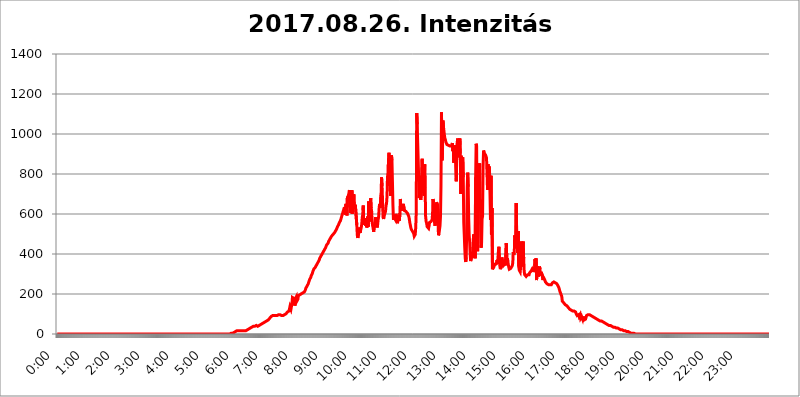
| Category | 2017.08.26. Intenzitás [W/m^2] |
|---|---|
| 0.0 | 0 |
| 0.0006944444444444445 | 0 |
| 0.001388888888888889 | 0 |
| 0.0020833333333333333 | 0 |
| 0.002777777777777778 | 0 |
| 0.003472222222222222 | 0 |
| 0.004166666666666667 | 0 |
| 0.004861111111111111 | 0 |
| 0.005555555555555556 | 0 |
| 0.0062499999999999995 | 0 |
| 0.006944444444444444 | 0 |
| 0.007638888888888889 | 0 |
| 0.008333333333333333 | 0 |
| 0.009027777777777779 | 0 |
| 0.009722222222222222 | 0 |
| 0.010416666666666666 | 0 |
| 0.011111111111111112 | 0 |
| 0.011805555555555555 | 0 |
| 0.012499999999999999 | 0 |
| 0.013194444444444444 | 0 |
| 0.013888888888888888 | 0 |
| 0.014583333333333332 | 0 |
| 0.015277777777777777 | 0 |
| 0.015972222222222224 | 0 |
| 0.016666666666666666 | 0 |
| 0.017361111111111112 | 0 |
| 0.018055555555555557 | 0 |
| 0.01875 | 0 |
| 0.019444444444444445 | 0 |
| 0.02013888888888889 | 0 |
| 0.020833333333333332 | 0 |
| 0.02152777777777778 | 0 |
| 0.022222222222222223 | 0 |
| 0.02291666666666667 | 0 |
| 0.02361111111111111 | 0 |
| 0.024305555555555556 | 0 |
| 0.024999999999999998 | 0 |
| 0.025694444444444447 | 0 |
| 0.02638888888888889 | 0 |
| 0.027083333333333334 | 0 |
| 0.027777777777777776 | 0 |
| 0.02847222222222222 | 0 |
| 0.029166666666666664 | 0 |
| 0.029861111111111113 | 0 |
| 0.030555555555555555 | 0 |
| 0.03125 | 0 |
| 0.03194444444444445 | 0 |
| 0.03263888888888889 | 0 |
| 0.03333333333333333 | 0 |
| 0.034027777777777775 | 0 |
| 0.034722222222222224 | 0 |
| 0.035416666666666666 | 0 |
| 0.036111111111111115 | 0 |
| 0.03680555555555556 | 0 |
| 0.0375 | 0 |
| 0.03819444444444444 | 0 |
| 0.03888888888888889 | 0 |
| 0.03958333333333333 | 0 |
| 0.04027777777777778 | 0 |
| 0.04097222222222222 | 0 |
| 0.041666666666666664 | 0 |
| 0.042361111111111106 | 0 |
| 0.04305555555555556 | 0 |
| 0.043750000000000004 | 0 |
| 0.044444444444444446 | 0 |
| 0.04513888888888889 | 0 |
| 0.04583333333333334 | 0 |
| 0.04652777777777778 | 0 |
| 0.04722222222222222 | 0 |
| 0.04791666666666666 | 0 |
| 0.04861111111111111 | 0 |
| 0.049305555555555554 | 0 |
| 0.049999999999999996 | 0 |
| 0.05069444444444445 | 0 |
| 0.051388888888888894 | 0 |
| 0.052083333333333336 | 0 |
| 0.05277777777777778 | 0 |
| 0.05347222222222222 | 0 |
| 0.05416666666666667 | 0 |
| 0.05486111111111111 | 0 |
| 0.05555555555555555 | 0 |
| 0.05625 | 0 |
| 0.05694444444444444 | 0 |
| 0.057638888888888885 | 0 |
| 0.05833333333333333 | 0 |
| 0.05902777777777778 | 0 |
| 0.059722222222222225 | 0 |
| 0.06041666666666667 | 0 |
| 0.061111111111111116 | 0 |
| 0.06180555555555556 | 0 |
| 0.0625 | 0 |
| 0.06319444444444444 | 0 |
| 0.06388888888888888 | 0 |
| 0.06458333333333334 | 0 |
| 0.06527777777777778 | 0 |
| 0.06597222222222222 | 0 |
| 0.06666666666666667 | 0 |
| 0.06736111111111111 | 0 |
| 0.06805555555555555 | 0 |
| 0.06874999999999999 | 0 |
| 0.06944444444444443 | 0 |
| 0.07013888888888889 | 0 |
| 0.07083333333333333 | 0 |
| 0.07152777777777779 | 0 |
| 0.07222222222222223 | 0 |
| 0.07291666666666667 | 0 |
| 0.07361111111111111 | 0 |
| 0.07430555555555556 | 0 |
| 0.075 | 0 |
| 0.07569444444444444 | 0 |
| 0.0763888888888889 | 0 |
| 0.07708333333333334 | 0 |
| 0.07777777777777778 | 0 |
| 0.07847222222222222 | 0 |
| 0.07916666666666666 | 0 |
| 0.0798611111111111 | 0 |
| 0.08055555555555556 | 0 |
| 0.08125 | 0 |
| 0.08194444444444444 | 0 |
| 0.08263888888888889 | 0 |
| 0.08333333333333333 | 0 |
| 0.08402777777777777 | 0 |
| 0.08472222222222221 | 0 |
| 0.08541666666666665 | 0 |
| 0.08611111111111112 | 0 |
| 0.08680555555555557 | 0 |
| 0.08750000000000001 | 0 |
| 0.08819444444444445 | 0 |
| 0.08888888888888889 | 0 |
| 0.08958333333333333 | 0 |
| 0.09027777777777778 | 0 |
| 0.09097222222222222 | 0 |
| 0.09166666666666667 | 0 |
| 0.09236111111111112 | 0 |
| 0.09305555555555556 | 0 |
| 0.09375 | 0 |
| 0.09444444444444444 | 0 |
| 0.09513888888888888 | 0 |
| 0.09583333333333333 | 0 |
| 0.09652777777777777 | 0 |
| 0.09722222222222222 | 0 |
| 0.09791666666666667 | 0 |
| 0.09861111111111111 | 0 |
| 0.09930555555555555 | 0 |
| 0.09999999999999999 | 0 |
| 0.10069444444444443 | 0 |
| 0.1013888888888889 | 0 |
| 0.10208333333333335 | 0 |
| 0.10277777777777779 | 0 |
| 0.10347222222222223 | 0 |
| 0.10416666666666667 | 0 |
| 0.10486111111111111 | 0 |
| 0.10555555555555556 | 0 |
| 0.10625 | 0 |
| 0.10694444444444444 | 0 |
| 0.1076388888888889 | 0 |
| 0.10833333333333334 | 0 |
| 0.10902777777777778 | 0 |
| 0.10972222222222222 | 0 |
| 0.1111111111111111 | 0 |
| 0.11180555555555556 | 0 |
| 0.11180555555555556 | 0 |
| 0.1125 | 0 |
| 0.11319444444444444 | 0 |
| 0.11388888888888889 | 0 |
| 0.11458333333333333 | 0 |
| 0.11527777777777777 | 0 |
| 0.11597222222222221 | 0 |
| 0.11666666666666665 | 0 |
| 0.1173611111111111 | 0 |
| 0.11805555555555557 | 0 |
| 0.11944444444444445 | 0 |
| 0.12013888888888889 | 0 |
| 0.12083333333333333 | 0 |
| 0.12152777777777778 | 0 |
| 0.12222222222222223 | 0 |
| 0.12291666666666667 | 0 |
| 0.12291666666666667 | 0 |
| 0.12361111111111112 | 0 |
| 0.12430555555555556 | 0 |
| 0.125 | 0 |
| 0.12569444444444444 | 0 |
| 0.12638888888888888 | 0 |
| 0.12708333333333333 | 0 |
| 0.16875 | 0 |
| 0.12847222222222224 | 0 |
| 0.12916666666666668 | 0 |
| 0.12986111111111112 | 0 |
| 0.13055555555555556 | 0 |
| 0.13125 | 0 |
| 0.13194444444444445 | 0 |
| 0.1326388888888889 | 0 |
| 0.13333333333333333 | 0 |
| 0.13402777777777777 | 0 |
| 0.13402777777777777 | 0 |
| 0.13472222222222222 | 0 |
| 0.13541666666666666 | 0 |
| 0.1361111111111111 | 0 |
| 0.13749999999999998 | 0 |
| 0.13819444444444443 | 0 |
| 0.1388888888888889 | 0 |
| 0.13958333333333334 | 0 |
| 0.14027777777777778 | 0 |
| 0.14097222222222222 | 0 |
| 0.14166666666666666 | 0 |
| 0.1423611111111111 | 0 |
| 0.14305555555555557 | 0 |
| 0.14375000000000002 | 0 |
| 0.14444444444444446 | 0 |
| 0.1451388888888889 | 0 |
| 0.1451388888888889 | 0 |
| 0.14652777777777778 | 0 |
| 0.14722222222222223 | 0 |
| 0.14791666666666667 | 0 |
| 0.1486111111111111 | 0 |
| 0.14930555555555555 | 0 |
| 0.15 | 0 |
| 0.15069444444444444 | 0 |
| 0.15138888888888888 | 0 |
| 0.15208333333333332 | 0 |
| 0.15277777777777776 | 0 |
| 0.15347222222222223 | 0 |
| 0.15416666666666667 | 0 |
| 0.15486111111111112 | 0 |
| 0.15555555555555556 | 0 |
| 0.15625 | 0 |
| 0.15694444444444444 | 0 |
| 0.15763888888888888 | 0 |
| 0.15833333333333333 | 0 |
| 0.15902777777777777 | 0 |
| 0.15972222222222224 | 0 |
| 0.16041666666666668 | 0 |
| 0.16111111111111112 | 0 |
| 0.16180555555555556 | 0 |
| 0.1625 | 0 |
| 0.16319444444444445 | 0 |
| 0.1638888888888889 | 0 |
| 0.16458333333333333 | 0 |
| 0.16527777777777777 | 0 |
| 0.16597222222222222 | 0 |
| 0.16666666666666666 | 0 |
| 0.1673611111111111 | 0 |
| 0.16805555555555554 | 0 |
| 0.16874999999999998 | 0 |
| 0.16944444444444443 | 0 |
| 0.17013888888888887 | 0 |
| 0.1708333333333333 | 0 |
| 0.17152777777777775 | 0 |
| 0.17222222222222225 | 0 |
| 0.1729166666666667 | 0 |
| 0.17361111111111113 | 0 |
| 0.17430555555555557 | 0 |
| 0.17500000000000002 | 0 |
| 0.17569444444444446 | 0 |
| 0.1763888888888889 | 0 |
| 0.17708333333333334 | 0 |
| 0.17777777777777778 | 0 |
| 0.17847222222222223 | 0 |
| 0.17916666666666667 | 0 |
| 0.1798611111111111 | 0 |
| 0.18055555555555555 | 0 |
| 0.18125 | 0 |
| 0.18194444444444444 | 0 |
| 0.1826388888888889 | 0 |
| 0.18333333333333335 | 0 |
| 0.1840277777777778 | 0 |
| 0.18472222222222223 | 0 |
| 0.18541666666666667 | 0 |
| 0.18611111111111112 | 0 |
| 0.18680555555555556 | 0 |
| 0.1875 | 0 |
| 0.18819444444444444 | 0 |
| 0.18888888888888888 | 0 |
| 0.18958333333333333 | 0 |
| 0.19027777777777777 | 0 |
| 0.1909722222222222 | 0 |
| 0.19166666666666665 | 0 |
| 0.19236111111111112 | 0 |
| 0.19305555555555554 | 0 |
| 0.19375 | 0 |
| 0.19444444444444445 | 0 |
| 0.1951388888888889 | 0 |
| 0.19583333333333333 | 0 |
| 0.19652777777777777 | 0 |
| 0.19722222222222222 | 0 |
| 0.19791666666666666 | 0 |
| 0.1986111111111111 | 0 |
| 0.19930555555555554 | 0 |
| 0.19999999999999998 | 0 |
| 0.20069444444444443 | 0 |
| 0.20138888888888887 | 0 |
| 0.2020833333333333 | 0 |
| 0.2027777777777778 | 0 |
| 0.2034722222222222 | 0 |
| 0.2041666666666667 | 0 |
| 0.20486111111111113 | 0 |
| 0.20555555555555557 | 0 |
| 0.20625000000000002 | 0 |
| 0.20694444444444446 | 0 |
| 0.2076388888888889 | 0 |
| 0.20833333333333334 | 0 |
| 0.20902777777777778 | 0 |
| 0.20972222222222223 | 0 |
| 0.21041666666666667 | 0 |
| 0.2111111111111111 | 0 |
| 0.21180555555555555 | 0 |
| 0.2125 | 0 |
| 0.21319444444444444 | 0 |
| 0.2138888888888889 | 0 |
| 0.21458333333333335 | 0 |
| 0.2152777777777778 | 0 |
| 0.21597222222222223 | 0 |
| 0.21666666666666667 | 0 |
| 0.21736111111111112 | 0 |
| 0.21805555555555556 | 0 |
| 0.21875 | 0 |
| 0.21944444444444444 | 0 |
| 0.22013888888888888 | 0 |
| 0.22083333333333333 | 0 |
| 0.22152777777777777 | 0 |
| 0.2222222222222222 | 0 |
| 0.22291666666666665 | 0 |
| 0.2236111111111111 | 0 |
| 0.22430555555555556 | 0 |
| 0.225 | 0 |
| 0.22569444444444445 | 0 |
| 0.2263888888888889 | 0 |
| 0.22708333333333333 | 0 |
| 0.22777777777777777 | 0 |
| 0.22847222222222222 | 0 |
| 0.22916666666666666 | 0 |
| 0.2298611111111111 | 0 |
| 0.23055555555555554 | 0 |
| 0.23124999999999998 | 0 |
| 0.23194444444444443 | 0 |
| 0.23263888888888887 | 0 |
| 0.2333333333333333 | 0 |
| 0.2340277777777778 | 0 |
| 0.2347222222222222 | 0 |
| 0.2354166666666667 | 0 |
| 0.23611111111111113 | 0 |
| 0.23680555555555557 | 0 |
| 0.23750000000000002 | 0 |
| 0.23819444444444446 | 0 |
| 0.2388888888888889 | 0 |
| 0.23958333333333334 | 0 |
| 0.24027777777777778 | 0 |
| 0.24097222222222223 | 0 |
| 0.24166666666666667 | 0 |
| 0.2423611111111111 | 0 |
| 0.24305555555555555 | 3.525 |
| 0.24375 | 3.525 |
| 0.24444444444444446 | 3.525 |
| 0.24513888888888888 | 3.525 |
| 0.24583333333333335 | 3.525 |
| 0.2465277777777778 | 3.525 |
| 0.24722222222222223 | 3.525 |
| 0.24791666666666667 | 7.887 |
| 0.24861111111111112 | 7.887 |
| 0.24930555555555556 | 7.887 |
| 0.25 | 12.257 |
| 0.25069444444444444 | 12.257 |
| 0.2513888888888889 | 12.257 |
| 0.2520833333333333 | 16.636 |
| 0.25277777777777777 | 16.636 |
| 0.2534722222222222 | 16.636 |
| 0.25416666666666665 | 16.636 |
| 0.2548611111111111 | 16.636 |
| 0.2555555555555556 | 16.636 |
| 0.25625000000000003 | 16.636 |
| 0.2569444444444445 | 16.636 |
| 0.2576388888888889 | 16.636 |
| 0.25833333333333336 | 16.636 |
| 0.2590277777777778 | 16.636 |
| 0.25972222222222224 | 16.636 |
| 0.2604166666666667 | 16.636 |
| 0.2611111111111111 | 16.636 |
| 0.26180555555555557 | 16.636 |
| 0.2625 | 16.636 |
| 0.26319444444444445 | 16.636 |
| 0.2638888888888889 | 21.024 |
| 0.26458333333333334 | 16.636 |
| 0.2652777777777778 | 21.024 |
| 0.2659722222222222 | 21.024 |
| 0.26666666666666666 | 21.024 |
| 0.2673611111111111 | 21.024 |
| 0.26805555555555555 | 21.024 |
| 0.26875 | 25.419 |
| 0.26944444444444443 | 25.419 |
| 0.2701388888888889 | 25.419 |
| 0.2708333333333333 | 29.823 |
| 0.27152777777777776 | 29.823 |
| 0.2722222222222222 | 29.823 |
| 0.27291666666666664 | 34.234 |
| 0.2736111111111111 | 34.234 |
| 0.2743055555555555 | 38.653 |
| 0.27499999999999997 | 38.653 |
| 0.27569444444444446 | 38.653 |
| 0.27638888888888885 | 38.653 |
| 0.27708333333333335 | 38.653 |
| 0.2777777777777778 | 43.079 |
| 0.27847222222222223 | 43.079 |
| 0.2791666666666667 | 43.079 |
| 0.2798611111111111 | 43.079 |
| 0.28055555555555556 | 43.079 |
| 0.28125 | 38.653 |
| 0.28194444444444444 | 43.079 |
| 0.2826388888888889 | 43.079 |
| 0.2833333333333333 | 43.079 |
| 0.28402777777777777 | 43.079 |
| 0.2847222222222222 | 47.511 |
| 0.28541666666666665 | 47.511 |
| 0.28611111111111115 | 47.511 |
| 0.28680555555555554 | 51.951 |
| 0.28750000000000003 | 51.951 |
| 0.2881944444444445 | 51.951 |
| 0.2888888888888889 | 56.398 |
| 0.28958333333333336 | 56.398 |
| 0.2902777777777778 | 60.85 |
| 0.29097222222222224 | 60.85 |
| 0.2916666666666667 | 60.85 |
| 0.2923611111111111 | 65.31 |
| 0.29305555555555557 | 65.31 |
| 0.29375 | 65.31 |
| 0.29444444444444445 | 65.31 |
| 0.2951388888888889 | 69.775 |
| 0.29583333333333334 | 69.775 |
| 0.2965277777777778 | 74.246 |
| 0.2972222222222222 | 74.246 |
| 0.29791666666666666 | 78.722 |
| 0.2986111111111111 | 83.205 |
| 0.29930555555555555 | 83.205 |
| 0.3 | 87.692 |
| 0.30069444444444443 | 87.692 |
| 0.3013888888888889 | 92.184 |
| 0.3020833333333333 | 92.184 |
| 0.30277777777777776 | 92.184 |
| 0.3034722222222222 | 92.184 |
| 0.30416666666666664 | 92.184 |
| 0.3048611111111111 | 92.184 |
| 0.3055555555555555 | 92.184 |
| 0.30624999999999997 | 92.184 |
| 0.3069444444444444 | 92.184 |
| 0.3076388888888889 | 92.184 |
| 0.30833333333333335 | 92.184 |
| 0.3090277777777778 | 96.682 |
| 0.30972222222222223 | 96.682 |
| 0.3104166666666667 | 96.682 |
| 0.3111111111111111 | 96.682 |
| 0.31180555555555556 | 96.682 |
| 0.3125 | 96.682 |
| 0.31319444444444444 | 96.682 |
| 0.3138888888888889 | 92.184 |
| 0.3145833333333333 | 92.184 |
| 0.31527777777777777 | 92.184 |
| 0.3159722222222222 | 92.184 |
| 0.31666666666666665 | 92.184 |
| 0.31736111111111115 | 92.184 |
| 0.31805555555555554 | 92.184 |
| 0.31875000000000003 | 96.682 |
| 0.3194444444444445 | 96.682 |
| 0.3201388888888889 | 101.184 |
| 0.32083333333333336 | 101.184 |
| 0.3215277777777778 | 105.69 |
| 0.32222222222222224 | 105.69 |
| 0.3229166666666667 | 110.201 |
| 0.3236111111111111 | 110.201 |
| 0.32430555555555557 | 114.716 |
| 0.325 | 114.716 |
| 0.32569444444444445 | 119.235 |
| 0.3263888888888889 | 137.347 |
| 0.32708333333333334 | 132.814 |
| 0.3277777777777778 | 123.758 |
| 0.3284722222222222 | 128.284 |
| 0.32916666666666666 | 150.964 |
| 0.3298611111111111 | 182.82 |
| 0.33055555555555555 | 182.82 |
| 0.33125 | 182.82 |
| 0.33194444444444443 | 178.264 |
| 0.3326388888888889 | 173.709 |
| 0.3333333333333333 | 141.884 |
| 0.3340277777777778 | 178.264 |
| 0.3347222222222222 | 178.264 |
| 0.3354166666666667 | 187.378 |
| 0.3361111111111111 | 164.605 |
| 0.3368055555555556 | 169.156 |
| 0.33749999999999997 | 173.709 |
| 0.33819444444444446 | 191.937 |
| 0.33888888888888885 | 191.937 |
| 0.33958333333333335 | 191.937 |
| 0.34027777777777773 | 196.497 |
| 0.34097222222222223 | 196.497 |
| 0.3416666666666666 | 196.497 |
| 0.3423611111111111 | 201.058 |
| 0.3430555555555555 | 201.058 |
| 0.34375 | 201.058 |
| 0.3444444444444445 | 205.62 |
| 0.3451388888888889 | 205.62 |
| 0.3458333333333334 | 210.182 |
| 0.34652777777777777 | 210.182 |
| 0.34722222222222227 | 214.746 |
| 0.34791666666666665 | 219.309 |
| 0.34861111111111115 | 228.436 |
| 0.34930555555555554 | 228.436 |
| 0.35000000000000003 | 233 |
| 0.3506944444444444 | 242.127 |
| 0.3513888888888889 | 246.689 |
| 0.3520833333333333 | 251.251 |
| 0.3527777777777778 | 260.373 |
| 0.3534722222222222 | 264.932 |
| 0.3541666666666667 | 274.047 |
| 0.3548611111111111 | 278.603 |
| 0.35555555555555557 | 283.156 |
| 0.35625 | 292.259 |
| 0.35694444444444445 | 296.808 |
| 0.3576388888888889 | 301.354 |
| 0.35833333333333334 | 310.44 |
| 0.3590277777777778 | 314.98 |
| 0.3597222222222222 | 324.052 |
| 0.36041666666666666 | 324.052 |
| 0.3611111111111111 | 328.584 |
| 0.36180555555555555 | 333.113 |
| 0.3625 | 337.639 |
| 0.36319444444444443 | 342.162 |
| 0.3638888888888889 | 346.682 |
| 0.3645833333333333 | 351.198 |
| 0.3652777777777778 | 355.712 |
| 0.3659722222222222 | 360.221 |
| 0.3666666666666667 | 364.728 |
| 0.3673611111111111 | 369.23 |
| 0.3680555555555556 | 378.224 |
| 0.36874999999999997 | 382.715 |
| 0.36944444444444446 | 387.202 |
| 0.37013888888888885 | 391.685 |
| 0.37083333333333335 | 396.164 |
| 0.37152777777777773 | 400.638 |
| 0.37222222222222223 | 405.108 |
| 0.3729166666666666 | 409.574 |
| 0.3736111111111111 | 414.035 |
| 0.3743055555555555 | 418.492 |
| 0.375 | 422.943 |
| 0.3756944444444445 | 427.39 |
| 0.3763888888888889 | 431.833 |
| 0.3770833333333334 | 436.27 |
| 0.37777777777777777 | 445.129 |
| 0.37847222222222227 | 445.129 |
| 0.37916666666666665 | 449.551 |
| 0.37986111111111115 | 453.968 |
| 0.38055555555555554 | 462.786 |
| 0.38125000000000003 | 467.187 |
| 0.3819444444444444 | 471.582 |
| 0.3826388888888889 | 475.972 |
| 0.3833333333333333 | 480.356 |
| 0.3840277777777778 | 484.735 |
| 0.3847222222222222 | 489.108 |
| 0.3854166666666667 | 489.108 |
| 0.3861111111111111 | 493.475 |
| 0.38680555555555557 | 497.836 |
| 0.3875 | 502.192 |
| 0.38819444444444445 | 502.192 |
| 0.3888888888888889 | 506.542 |
| 0.38958333333333334 | 510.885 |
| 0.3902777777777778 | 515.223 |
| 0.3909722222222222 | 519.555 |
| 0.39166666666666666 | 523.88 |
| 0.3923611111111111 | 528.2 |
| 0.39305555555555555 | 536.82 |
| 0.39375 | 541.121 |
| 0.39444444444444443 | 545.416 |
| 0.3951388888888889 | 549.704 |
| 0.3958333333333333 | 558.261 |
| 0.3965277777777778 | 562.53 |
| 0.3972222222222222 | 566.793 |
| 0.3979166666666667 | 575.299 |
| 0.3986111111111111 | 583.779 |
| 0.3993055555555556 | 592.233 |
| 0.39999999999999997 | 600.661 |
| 0.40069444444444446 | 609.062 |
| 0.40138888888888885 | 613.252 |
| 0.40208333333333335 | 625.784 |
| 0.40277777777777773 | 634.105 |
| 0.40347222222222223 | 617.436 |
| 0.4041666666666666 | 596.45 |
| 0.4048611111111111 | 650.667 |
| 0.4055555555555555 | 642.4 |
| 0.40625 | 592.233 |
| 0.4069444444444445 | 683.473 |
| 0.4076388888888889 | 683.473 |
| 0.4083333333333334 | 691.608 |
| 0.40902777777777777 | 703.762 |
| 0.40972222222222227 | 719.877 |
| 0.41041666666666665 | 719.877 |
| 0.41111111111111115 | 604.864 |
| 0.41180555555555554 | 617.436 |
| 0.41250000000000003 | 609.062 |
| 0.4131944444444444 | 719.877 |
| 0.4138888888888889 | 600.661 |
| 0.4145833333333333 | 650.667 |
| 0.4152777777777778 | 683.473 |
| 0.4159722222222222 | 699.717 |
| 0.4166666666666667 | 634.105 |
| 0.4173611111111111 | 638.256 |
| 0.41805555555555557 | 646.537 |
| 0.41875 | 642.4 |
| 0.41944444444444445 | 642.4 |
| 0.4201388888888889 | 545.416 |
| 0.42083333333333334 | 493.475 |
| 0.4215277777777778 | 480.356 |
| 0.4222222222222222 | 484.735 |
| 0.42291666666666666 | 506.542 |
| 0.4236111111111111 | 510.885 |
| 0.42430555555555555 | 532.513 |
| 0.425 | 506.542 |
| 0.42569444444444443 | 523.88 |
| 0.4263888888888889 | 532.513 |
| 0.4270833333333333 | 549.704 |
| 0.4277777777777778 | 583.779 |
| 0.4284722222222222 | 596.45 |
| 0.4291666666666667 | 642.4 |
| 0.4298611111111111 | 558.261 |
| 0.4305555555555556 | 545.416 |
| 0.43124999999999997 | 579.542 |
| 0.43194444444444446 | 558.261 |
| 0.43263888888888885 | 541.121 |
| 0.43333333333333335 | 575.299 |
| 0.43402777777777773 | 532.513 |
| 0.43472222222222223 | 541.121 |
| 0.4354166666666666 | 588.009 |
| 0.4361111111111111 | 536.82 |
| 0.4368055555555555 | 663.019 |
| 0.4375 | 562.53 |
| 0.4381944444444445 | 566.793 |
| 0.4388888888888889 | 617.436 |
| 0.4395833333333334 | 679.395 |
| 0.44027777777777777 | 629.948 |
| 0.44097222222222227 | 613.252 |
| 0.44166666666666665 | 558.261 |
| 0.44236111111111115 | 541.121 |
| 0.44305555555555554 | 528.2 |
| 0.44375000000000003 | 510.885 |
| 0.4444444444444444 | 515.223 |
| 0.4451388888888889 | 549.704 |
| 0.4458333333333333 | 549.704 |
| 0.4465277777777778 | 583.779 |
| 0.4472222222222222 | 553.986 |
| 0.4479166666666667 | 549.704 |
| 0.4486111111111111 | 532.513 |
| 0.44930555555555557 | 545.416 |
| 0.45 | 571.049 |
| 0.45069444444444445 | 583.779 |
| 0.4513888888888889 | 625.784 |
| 0.45208333333333334 | 650.667 |
| 0.4527777777777778 | 629.948 |
| 0.4534722222222222 | 634.105 |
| 0.45416666666666666 | 695.666 |
| 0.4548611111111111 | 783.342 |
| 0.45555555555555555 | 739.877 |
| 0.45625 | 667.123 |
| 0.45694444444444443 | 583.779 |
| 0.4576388888888889 | 575.299 |
| 0.4583333333333333 | 588.009 |
| 0.4590277777777778 | 596.45 |
| 0.4597222222222222 | 592.233 |
| 0.4604166666666667 | 613.252 |
| 0.4611111111111111 | 642.4 |
| 0.4618055555555556 | 650.667 |
| 0.46249999999999997 | 687.544 |
| 0.46319444444444446 | 791.169 |
| 0.46388888888888885 | 779.42 |
| 0.46458333333333335 | 868.305 |
| 0.46527777777777773 | 906.223 |
| 0.46597222222222223 | 739.877 |
| 0.4666666666666666 | 806.757 |
| 0.4673611111111111 | 691.608 |
| 0.4680555555555555 | 763.674 |
| 0.46875 | 894.885 |
| 0.4694444444444445 | 868.305 |
| 0.4701388888888889 | 759.723 |
| 0.4708333333333334 | 642.4 |
| 0.47152777777777777 | 571.049 |
| 0.47222222222222227 | 583.779 |
| 0.47291666666666665 | 579.542 |
| 0.47361111111111115 | 579.542 |
| 0.47430555555555554 | 571.049 |
| 0.47500000000000003 | 600.661 |
| 0.4756944444444444 | 588.009 |
| 0.4763888888888889 | 566.793 |
| 0.4770833333333333 | 553.986 |
| 0.4777777777777778 | 558.261 |
| 0.4784722222222222 | 558.261 |
| 0.4791666666666667 | 592.233 |
| 0.4798611111111111 | 566.793 |
| 0.48055555555555557 | 604.864 |
| 0.48125 | 675.311 |
| 0.48194444444444445 | 625.784 |
| 0.4826388888888889 | 617.436 |
| 0.48333333333333334 | 629.948 |
| 0.4840277777777778 | 617.436 |
| 0.4847222222222222 | 617.436 |
| 0.48541666666666666 | 650.667 |
| 0.4861111111111111 | 650.667 |
| 0.48680555555555555 | 617.436 |
| 0.4875 | 613.252 |
| 0.48819444444444443 | 621.613 |
| 0.4888888888888889 | 613.252 |
| 0.4895833333333333 | 613.252 |
| 0.4902777777777778 | 609.062 |
| 0.4909722222222222 | 604.864 |
| 0.4916666666666667 | 604.864 |
| 0.4923611111111111 | 600.661 |
| 0.4930555555555556 | 588.009 |
| 0.49374999999999997 | 575.299 |
| 0.49444444444444446 | 558.261 |
| 0.49513888888888885 | 545.416 |
| 0.49583333333333335 | 532.513 |
| 0.49652777777777773 | 523.88 |
| 0.49722222222222223 | 519.555 |
| 0.4979166666666666 | 515.223 |
| 0.4986111111111111 | 515.223 |
| 0.4993055555555555 | 515.223 |
| 0.5 | 502.192 |
| 0.5006944444444444 | 489.108 |
| 0.5013888888888889 | 489.108 |
| 0.5020833333333333 | 497.836 |
| 0.5027777777777778 | 532.513 |
| 0.5034722222222222 | 604.864 |
| 0.5041666666666667 | 1105.019 |
| 0.5048611111111111 | 1048.508 |
| 0.5055555555555555 | 955.071 |
| 0.50625 | 868.305 |
| 0.5069444444444444 | 864.493 |
| 0.5076388888888889 | 679.395 |
| 0.5083333333333333 | 711.832 |
| 0.5090277777777777 | 719.877 |
| 0.5097222222222222 | 671.22 |
| 0.5104166666666666 | 691.608 |
| 0.5111111111111112 | 802.868 |
| 0.5118055555555555 | 875.918 |
| 0.5125000000000001 | 707.8 |
| 0.5131944444444444 | 783.342 |
| 0.513888888888889 | 810.641 |
| 0.5145833333333333 | 691.608 |
| 0.5152777777777778 | 849.199 |
| 0.5159722222222222 | 731.896 |
| 0.5166666666666667 | 588.009 |
| 0.517361111111111 | 562.53 |
| 0.5180555555555556 | 553.986 |
| 0.5187499999999999 | 536.82 |
| 0.5194444444444445 | 541.121 |
| 0.5201388888888888 | 532.513 |
| 0.5208333333333334 | 528.2 |
| 0.5215277777777778 | 541.121 |
| 0.5222222222222223 | 558.261 |
| 0.5229166666666667 | 558.261 |
| 0.5236111111111111 | 562.53 |
| 0.5243055555555556 | 562.53 |
| 0.525 | 566.793 |
| 0.5256944444444445 | 571.049 |
| 0.5263888888888889 | 600.661 |
| 0.5270833333333333 | 675.311 |
| 0.5277777777777778 | 634.105 |
| 0.5284722222222222 | 600.661 |
| 0.5291666666666667 | 558.261 |
| 0.5298611111111111 | 541.121 |
| 0.5305555555555556 | 562.53 |
| 0.53125 | 592.233 |
| 0.5319444444444444 | 658.909 |
| 0.5326388888888889 | 654.791 |
| 0.5333333333333333 | 646.537 |
| 0.5340277777777778 | 558.261 |
| 0.5347222222222222 | 493.475 |
| 0.5354166666666667 | 502.192 |
| 0.5361111111111111 | 497.836 |
| 0.5368055555555555 | 541.121 |
| 0.5375 | 588.009 |
| 0.5381944444444444 | 739.877 |
| 0.5388888888888889 | 1108.816 |
| 0.5395833333333333 | 868.305 |
| 0.5402777777777777 | 906.223 |
| 0.5409722222222222 | 1067.267 |
| 0.5416666666666666 | 1037.277 |
| 0.5423611111111112 | 1014.852 |
| 0.5430555555555555 | 992.448 |
| 0.5437500000000001 | 977.508 |
| 0.5444444444444444 | 970.034 |
| 0.545138888888889 | 958.814 |
| 0.5458333333333333 | 955.071 |
| 0.5465277777777778 | 947.58 |
| 0.5472222222222222 | 947.58 |
| 0.5479166666666667 | 951.327 |
| 0.548611111111111 | 943.832 |
| 0.5493055555555556 | 940.082 |
| 0.5499999999999999 | 940.082 |
| 0.5506944444444445 | 940.082 |
| 0.5513888888888888 | 940.082 |
| 0.5520833333333334 | 940.082 |
| 0.5527777777777778 | 940.082 |
| 0.5534722222222223 | 943.832 |
| 0.5541666666666667 | 955.071 |
| 0.5548611111111111 | 913.766 |
| 0.5555555555555556 | 928.819 |
| 0.55625 | 856.855 |
| 0.5569444444444445 | 925.06 |
| 0.5576388888888889 | 898.668 |
| 0.5583333333333333 | 943.832 |
| 0.5590277777777778 | 943.832 |
| 0.5597222222222222 | 763.674 |
| 0.5604166666666667 | 940.082 |
| 0.5611111111111111 | 962.555 |
| 0.5618055555555556 | 977.508 |
| 0.5625 | 977.508 |
| 0.5631944444444444 | 977.508 |
| 0.5638888888888889 | 883.516 |
| 0.5645833333333333 | 977.508 |
| 0.5652777777777778 | 902.447 |
| 0.5659722222222222 | 699.717 |
| 0.5666666666666667 | 891.099 |
| 0.5673611111111111 | 791.169 |
| 0.5680555555555555 | 875.918 |
| 0.56875 | 883.516 |
| 0.5694444444444444 | 783.342 |
| 0.5701388888888889 | 558.261 |
| 0.5708333333333333 | 497.836 |
| 0.5715277777777777 | 431.833 |
| 0.5722222222222222 | 378.224 |
| 0.5729166666666666 | 360.221 |
| 0.5736111111111112 | 382.715 |
| 0.5743055555555555 | 523.88 |
| 0.5750000000000001 | 735.89 |
| 0.5756944444444444 | 806.757 |
| 0.576388888888889 | 735.89 |
| 0.5770833333333333 | 575.299 |
| 0.5777777777777778 | 493.475 |
| 0.5784722222222222 | 458.38 |
| 0.5791666666666667 | 396.164 |
| 0.579861111111111 | 364.728 |
| 0.5805555555555556 | 369.23 |
| 0.5812499999999999 | 387.202 |
| 0.5819444444444445 | 396.164 |
| 0.5826388888888888 | 414.035 |
| 0.5833333333333334 | 462.786 |
| 0.5840277777777778 | 497.836 |
| 0.5847222222222223 | 382.715 |
| 0.5854166666666667 | 497.836 |
| 0.5861111111111111 | 378.224 |
| 0.5868055555555556 | 783.342 |
| 0.5875 | 951.327 |
| 0.5881944444444445 | 940.082 |
| 0.5888888888888889 | 545.416 |
| 0.5895833333333333 | 414.035 |
| 0.5902777777777778 | 802.868 |
| 0.5909722222222222 | 822.26 |
| 0.5916666666666667 | 691.608 |
| 0.5923611111111111 | 853.029 |
| 0.5930555555555556 | 617.436 |
| 0.59375 | 671.22 |
| 0.5944444444444444 | 431.833 |
| 0.5951388888888889 | 453.968 |
| 0.5958333333333333 | 575.299 |
| 0.5965277777777778 | 588.009 |
| 0.5972222222222222 | 837.682 |
| 0.5979166666666667 | 917.534 |
| 0.5986111111111111 | 909.996 |
| 0.5993055555555555 | 902.447 |
| 0.6 | 898.668 |
| 0.6006944444444444 | 894.885 |
| 0.6013888888888889 | 887.309 |
| 0.6020833333333333 | 879.719 |
| 0.6027777777777777 | 875.918 |
| 0.6034722222222222 | 719.877 |
| 0.6041666666666666 | 849.199 |
| 0.6048611111111112 | 802.868 |
| 0.6055555555555555 | 837.682 |
| 0.6062500000000001 | 814.519 |
| 0.6069444444444444 | 699.717 |
| 0.607638888888889 | 571.049 |
| 0.6083333333333333 | 791.169 |
| 0.6090277777777778 | 497.836 |
| 0.6097222222222222 | 629.948 |
| 0.6104166666666667 | 324.052 |
| 0.611111111111111 | 319.517 |
| 0.6118055555555556 | 324.052 |
| 0.6124999999999999 | 337.639 |
| 0.6131944444444445 | 355.712 |
| 0.6138888888888888 | 346.682 |
| 0.6145833333333334 | 346.682 |
| 0.6152777777777778 | 342.162 |
| 0.6159722222222223 | 351.198 |
| 0.6166666666666667 | 369.23 |
| 0.6173611111111111 | 355.712 |
| 0.6180555555555556 | 373.729 |
| 0.61875 | 414.035 |
| 0.6194444444444445 | 436.27 |
| 0.6201388888888889 | 360.221 |
| 0.6208333333333333 | 337.639 |
| 0.6215277777777778 | 324.052 |
| 0.6222222222222222 | 337.639 |
| 0.6229166666666667 | 360.221 |
| 0.6236111111111111 | 382.715 |
| 0.6243055555555556 | 387.202 |
| 0.625 | 355.712 |
| 0.6256944444444444 | 342.162 |
| 0.6263888888888889 | 337.639 |
| 0.6270833333333333 | 337.639 |
| 0.6277777777777778 | 351.198 |
| 0.6284722222222222 | 342.162 |
| 0.6291666666666667 | 346.682 |
| 0.6298611111111111 | 453.968 |
| 0.6305555555555555 | 369.23 |
| 0.63125 | 378.224 |
| 0.6319444444444444 | 364.728 |
| 0.6326388888888889 | 346.682 |
| 0.6333333333333333 | 333.113 |
| 0.6340277777777777 | 324.052 |
| 0.6347222222222222 | 319.517 |
| 0.6354166666666666 | 328.584 |
| 0.6361111111111112 | 328.584 |
| 0.6368055555555555 | 328.584 |
| 0.6375000000000001 | 333.113 |
| 0.6381944444444444 | 342.162 |
| 0.638888888888889 | 355.712 |
| 0.6395833333333333 | 409.574 |
| 0.6402777777777778 | 396.164 |
| 0.6409722222222222 | 405.108 |
| 0.6416666666666667 | 493.475 |
| 0.642361111111111 | 458.38 |
| 0.6430555555555556 | 449.551 |
| 0.6437499999999999 | 654.791 |
| 0.6444444444444445 | 471.582 |
| 0.6451388888888888 | 440.702 |
| 0.6458333333333334 | 405.108 |
| 0.6465277777777778 | 515.223 |
| 0.6472222222222223 | 337.639 |
| 0.6479166666666667 | 319.517 |
| 0.6486111111111111 | 319.517 |
| 0.6493055555555556 | 310.44 |
| 0.65 | 337.639 |
| 0.6506944444444445 | 462.786 |
| 0.6513888888888889 | 405.108 |
| 0.6520833333333333 | 337.639 |
| 0.6527777777777778 | 409.574 |
| 0.6534722222222222 | 462.786 |
| 0.6541666666666667 | 378.224 |
| 0.6548611111111111 | 314.98 |
| 0.6555555555555556 | 296.808 |
| 0.65625 | 292.259 |
| 0.6569444444444444 | 296.808 |
| 0.6576388888888889 | 287.709 |
| 0.6583333333333333 | 283.156 |
| 0.6590277777777778 | 287.709 |
| 0.6597222222222222 | 296.808 |
| 0.6604166666666667 | 301.354 |
| 0.6611111111111111 | 296.808 |
| 0.6618055555555555 | 296.808 |
| 0.6625 | 305.898 |
| 0.6631944444444444 | 305.898 |
| 0.6638888888888889 | 310.44 |
| 0.6645833333333333 | 314.98 |
| 0.6652777777777777 | 319.517 |
| 0.6659722222222222 | 324.052 |
| 0.6666666666666666 | 319.517 |
| 0.6673611111111111 | 310.44 |
| 0.6680555555555556 | 333.113 |
| 0.6687500000000001 | 337.639 |
| 0.6694444444444444 | 310.44 |
| 0.6701388888888888 | 373.729 |
| 0.6708333333333334 | 324.052 |
| 0.6715277777777778 | 378.224 |
| 0.6722222222222222 | 269.49 |
| 0.6729166666666666 | 269.49 |
| 0.6736111111111112 | 337.639 |
| 0.6743055555555556 | 337.639 |
| 0.6749999999999999 | 287.709 |
| 0.6756944444444444 | 301.354 |
| 0.6763888888888889 | 337.639 |
| 0.6770833333333334 | 324.052 |
| 0.6777777777777777 | 292.259 |
| 0.6784722222222223 | 310.44 |
| 0.6791666666666667 | 305.898 |
| 0.6798611111111111 | 296.808 |
| 0.6805555555555555 | 292.259 |
| 0.68125 | 269.49 |
| 0.6819444444444445 | 283.156 |
| 0.6826388888888889 | 278.603 |
| 0.6833333333333332 | 274.047 |
| 0.6840277777777778 | 269.49 |
| 0.6847222222222222 | 260.373 |
| 0.6854166666666667 | 260.373 |
| 0.686111111111111 | 255.813 |
| 0.6868055555555556 | 251.251 |
| 0.6875 | 251.251 |
| 0.6881944444444444 | 251.251 |
| 0.688888888888889 | 246.689 |
| 0.6895833333333333 | 251.251 |
| 0.6902777777777778 | 246.689 |
| 0.6909722222222222 | 246.689 |
| 0.6916666666666668 | 242.127 |
| 0.6923611111111111 | 246.689 |
| 0.6930555555555555 | 246.689 |
| 0.69375 | 251.251 |
| 0.6944444444444445 | 255.813 |
| 0.6951388888888889 | 255.813 |
| 0.6958333333333333 | 255.813 |
| 0.6965277777777777 | 260.373 |
| 0.6972222222222223 | 260.373 |
| 0.6979166666666666 | 260.373 |
| 0.6986111111111111 | 255.813 |
| 0.6993055555555556 | 255.813 |
| 0.7000000000000001 | 251.251 |
| 0.7006944444444444 | 251.251 |
| 0.7013888888888888 | 246.689 |
| 0.7020833333333334 | 242.127 |
| 0.7027777777777778 | 237.564 |
| 0.7034722222222222 | 233 |
| 0.7041666666666666 | 223.873 |
| 0.7048611111111112 | 214.746 |
| 0.7055555555555556 | 210.182 |
| 0.7062499999999999 | 201.058 |
| 0.7069444444444444 | 196.497 |
| 0.7076388888888889 | 187.378 |
| 0.7083333333333334 | 164.605 |
| 0.7090277777777777 | 164.605 |
| 0.7097222222222223 | 160.056 |
| 0.7104166666666667 | 155.509 |
| 0.7111111111111111 | 155.509 |
| 0.7118055555555555 | 150.964 |
| 0.7125 | 146.423 |
| 0.7131944444444445 | 146.423 |
| 0.7138888888888889 | 141.884 |
| 0.7145833333333332 | 141.884 |
| 0.7152777777777778 | 137.347 |
| 0.7159722222222222 | 137.347 |
| 0.7166666666666667 | 132.814 |
| 0.717361111111111 | 132.814 |
| 0.7180555555555556 | 128.284 |
| 0.71875 | 123.758 |
| 0.7194444444444444 | 123.758 |
| 0.720138888888889 | 123.758 |
| 0.7208333333333333 | 119.235 |
| 0.7215277777777778 | 119.235 |
| 0.7222222222222222 | 119.235 |
| 0.7229166666666668 | 114.716 |
| 0.7236111111111111 | 114.716 |
| 0.7243055555555555 | 114.716 |
| 0.725 | 114.716 |
| 0.7256944444444445 | 114.716 |
| 0.7263888888888889 | 114.716 |
| 0.7270833333333333 | 110.201 |
| 0.7277777777777777 | 101.184 |
| 0.7284722222222223 | 105.69 |
| 0.7291666666666666 | 92.184 |
| 0.7298611111111111 | 87.692 |
| 0.7305555555555556 | 96.682 |
| 0.7312500000000001 | 96.682 |
| 0.7319444444444444 | 87.692 |
| 0.7326388888888888 | 83.205 |
| 0.7333333333333334 | 96.682 |
| 0.7340277777777778 | 78.722 |
| 0.7347222222222222 | 74.246 |
| 0.7354166666666666 | 87.692 |
| 0.7361111111111112 | 83.205 |
| 0.7368055555555556 | 74.246 |
| 0.7374999999999999 | 87.692 |
| 0.7381944444444444 | 83.205 |
| 0.7388888888888889 | 69.775 |
| 0.7395833333333334 | 69.775 |
| 0.7402777777777777 | 69.775 |
| 0.7409722222222223 | 74.246 |
| 0.7416666666666667 | 83.205 |
| 0.7423611111111111 | 92.184 |
| 0.7430555555555555 | 92.184 |
| 0.74375 | 96.682 |
| 0.7444444444444445 | 96.682 |
| 0.7451388888888889 | 96.682 |
| 0.7458333333333332 | 96.682 |
| 0.7465277777777778 | 96.682 |
| 0.7472222222222222 | 92.184 |
| 0.7479166666666667 | 92.184 |
| 0.748611111111111 | 92.184 |
| 0.7493055555555556 | 87.692 |
| 0.75 | 87.692 |
| 0.7506944444444444 | 87.692 |
| 0.751388888888889 | 83.205 |
| 0.7520833333333333 | 83.205 |
| 0.7527777777777778 | 83.205 |
| 0.7534722222222222 | 83.205 |
| 0.7541666666666668 | 83.205 |
| 0.7548611111111111 | 78.722 |
| 0.7555555555555555 | 78.722 |
| 0.75625 | 74.246 |
| 0.7569444444444445 | 74.246 |
| 0.7576388888888889 | 74.246 |
| 0.7583333333333333 | 74.246 |
| 0.7590277777777777 | 69.775 |
| 0.7597222222222223 | 69.775 |
| 0.7604166666666666 | 69.775 |
| 0.7611111111111111 | 65.31 |
| 0.7618055555555556 | 65.31 |
| 0.7625000000000001 | 65.31 |
| 0.7631944444444444 | 65.31 |
| 0.7638888888888888 | 60.85 |
| 0.7645833333333334 | 60.85 |
| 0.7652777777777778 | 60.85 |
| 0.7659722222222222 | 56.398 |
| 0.7666666666666666 | 56.398 |
| 0.7673611111111112 | 56.398 |
| 0.7680555555555556 | 56.398 |
| 0.7687499999999999 | 51.951 |
| 0.7694444444444444 | 51.951 |
| 0.7701388888888889 | 51.951 |
| 0.7708333333333334 | 47.511 |
| 0.7715277777777777 | 47.511 |
| 0.7722222222222223 | 47.511 |
| 0.7729166666666667 | 47.511 |
| 0.7736111111111111 | 43.079 |
| 0.7743055555555555 | 43.079 |
| 0.775 | 43.079 |
| 0.7756944444444445 | 43.079 |
| 0.7763888888888889 | 38.653 |
| 0.7770833333333332 | 38.653 |
| 0.7777777777777778 | 38.653 |
| 0.7784722222222222 | 38.653 |
| 0.7791666666666667 | 38.653 |
| 0.779861111111111 | 34.234 |
| 0.7805555555555556 | 34.234 |
| 0.78125 | 34.234 |
| 0.7819444444444444 | 34.234 |
| 0.782638888888889 | 29.823 |
| 0.7833333333333333 | 29.823 |
| 0.7840277777777778 | 29.823 |
| 0.7847222222222222 | 29.823 |
| 0.7854166666666668 | 29.823 |
| 0.7861111111111111 | 29.823 |
| 0.7868055555555555 | 25.419 |
| 0.7875 | 25.419 |
| 0.7881944444444445 | 25.419 |
| 0.7888888888888889 | 21.024 |
| 0.7895833333333333 | 21.024 |
| 0.7902777777777777 | 21.024 |
| 0.7909722222222223 | 21.024 |
| 0.7916666666666666 | 21.024 |
| 0.7923611111111111 | 21.024 |
| 0.7930555555555556 | 21.024 |
| 0.7937500000000001 | 16.636 |
| 0.7944444444444444 | 16.636 |
| 0.7951388888888888 | 16.636 |
| 0.7958333333333334 | 16.636 |
| 0.7965277777777778 | 16.636 |
| 0.7972222222222222 | 12.257 |
| 0.7979166666666666 | 12.257 |
| 0.7986111111111112 | 12.257 |
| 0.7993055555555556 | 12.257 |
| 0.7999999999999999 | 12.257 |
| 0.8006944444444444 | 12.257 |
| 0.8013888888888889 | 7.887 |
| 0.8020833333333334 | 7.887 |
| 0.8027777777777777 | 7.887 |
| 0.8034722222222223 | 7.887 |
| 0.8041666666666667 | 7.887 |
| 0.8048611111111111 | 3.525 |
| 0.8055555555555555 | 3.525 |
| 0.80625 | 3.525 |
| 0.8069444444444445 | 3.525 |
| 0.8076388888888889 | 3.525 |
| 0.8083333333333332 | 3.525 |
| 0.8090277777777778 | 3.525 |
| 0.8097222222222222 | 3.525 |
| 0.8104166666666667 | 3.525 |
| 0.811111111111111 | 0 |
| 0.8118055555555556 | 0 |
| 0.8125 | 0 |
| 0.8131944444444444 | 0 |
| 0.813888888888889 | 0 |
| 0.8145833333333333 | 0 |
| 0.8152777777777778 | 0 |
| 0.8159722222222222 | 0 |
| 0.8166666666666668 | 0 |
| 0.8173611111111111 | 0 |
| 0.8180555555555555 | 0 |
| 0.81875 | 0 |
| 0.8194444444444445 | 0 |
| 0.8201388888888889 | 0 |
| 0.8208333333333333 | 0 |
| 0.8215277777777777 | 0 |
| 0.8222222222222223 | 0 |
| 0.8229166666666666 | 0 |
| 0.8236111111111111 | 0 |
| 0.8243055555555556 | 0 |
| 0.8250000000000001 | 0 |
| 0.8256944444444444 | 0 |
| 0.8263888888888888 | 0 |
| 0.8270833333333334 | 0 |
| 0.8277777777777778 | 0 |
| 0.8284722222222222 | 0 |
| 0.8291666666666666 | 0 |
| 0.8298611111111112 | 0 |
| 0.8305555555555556 | 0 |
| 0.8312499999999999 | 0 |
| 0.8319444444444444 | 0 |
| 0.8326388888888889 | 0 |
| 0.8333333333333334 | 0 |
| 0.8340277777777777 | 0 |
| 0.8347222222222223 | 0 |
| 0.8354166666666667 | 0 |
| 0.8361111111111111 | 0 |
| 0.8368055555555555 | 0 |
| 0.8375 | 0 |
| 0.8381944444444445 | 0 |
| 0.8388888888888889 | 0 |
| 0.8395833333333332 | 0 |
| 0.8402777777777778 | 0 |
| 0.8409722222222222 | 0 |
| 0.8416666666666667 | 0 |
| 0.842361111111111 | 0 |
| 0.8430555555555556 | 0 |
| 0.84375 | 0 |
| 0.8444444444444444 | 0 |
| 0.845138888888889 | 0 |
| 0.8458333333333333 | 0 |
| 0.8465277777777778 | 0 |
| 0.8472222222222222 | 0 |
| 0.8479166666666668 | 0 |
| 0.8486111111111111 | 0 |
| 0.8493055555555555 | 0 |
| 0.85 | 0 |
| 0.8506944444444445 | 0 |
| 0.8513888888888889 | 0 |
| 0.8520833333333333 | 0 |
| 0.8527777777777777 | 0 |
| 0.8534722222222223 | 0 |
| 0.8541666666666666 | 0 |
| 0.8548611111111111 | 0 |
| 0.8555555555555556 | 0 |
| 0.8562500000000001 | 0 |
| 0.8569444444444444 | 0 |
| 0.8576388888888888 | 0 |
| 0.8583333333333334 | 0 |
| 0.8590277777777778 | 0 |
| 0.8597222222222222 | 0 |
| 0.8604166666666666 | 0 |
| 0.8611111111111112 | 0 |
| 0.8618055555555556 | 0 |
| 0.8624999999999999 | 0 |
| 0.8631944444444444 | 0 |
| 0.8638888888888889 | 0 |
| 0.8645833333333334 | 0 |
| 0.8652777777777777 | 0 |
| 0.8659722222222223 | 0 |
| 0.8666666666666667 | 0 |
| 0.8673611111111111 | 0 |
| 0.8680555555555555 | 0 |
| 0.86875 | 0 |
| 0.8694444444444445 | 0 |
| 0.8701388888888889 | 0 |
| 0.8708333333333332 | 0 |
| 0.8715277777777778 | 0 |
| 0.8722222222222222 | 0 |
| 0.8729166666666667 | 0 |
| 0.873611111111111 | 0 |
| 0.8743055555555556 | 0 |
| 0.875 | 0 |
| 0.8756944444444444 | 0 |
| 0.876388888888889 | 0 |
| 0.8770833333333333 | 0 |
| 0.8777777777777778 | 0 |
| 0.8784722222222222 | 0 |
| 0.8791666666666668 | 0 |
| 0.8798611111111111 | 0 |
| 0.8805555555555555 | 0 |
| 0.88125 | 0 |
| 0.8819444444444445 | 0 |
| 0.8826388888888889 | 0 |
| 0.8833333333333333 | 0 |
| 0.8840277777777777 | 0 |
| 0.8847222222222223 | 0 |
| 0.8854166666666666 | 0 |
| 0.8861111111111111 | 0 |
| 0.8868055555555556 | 0 |
| 0.8875000000000001 | 0 |
| 0.8881944444444444 | 0 |
| 0.8888888888888888 | 0 |
| 0.8895833333333334 | 0 |
| 0.8902777777777778 | 0 |
| 0.8909722222222222 | 0 |
| 0.8916666666666666 | 0 |
| 0.8923611111111112 | 0 |
| 0.8930555555555556 | 0 |
| 0.8937499999999999 | 0 |
| 0.8944444444444444 | 0 |
| 0.8951388888888889 | 0 |
| 0.8958333333333334 | 0 |
| 0.8965277777777777 | 0 |
| 0.8972222222222223 | 0 |
| 0.8979166666666667 | 0 |
| 0.8986111111111111 | 0 |
| 0.8993055555555555 | 0 |
| 0.9 | 0 |
| 0.9006944444444445 | 0 |
| 0.9013888888888889 | 0 |
| 0.9020833333333332 | 0 |
| 0.9027777777777778 | 0 |
| 0.9034722222222222 | 0 |
| 0.9041666666666667 | 0 |
| 0.904861111111111 | 0 |
| 0.9055555555555556 | 0 |
| 0.90625 | 0 |
| 0.9069444444444444 | 0 |
| 0.907638888888889 | 0 |
| 0.9083333333333333 | 0 |
| 0.9090277777777778 | 0 |
| 0.9097222222222222 | 0 |
| 0.9104166666666668 | 0 |
| 0.9111111111111111 | 0 |
| 0.9118055555555555 | 0 |
| 0.9125 | 0 |
| 0.9131944444444445 | 0 |
| 0.9138888888888889 | 0 |
| 0.9145833333333333 | 0 |
| 0.9152777777777777 | 0 |
| 0.9159722222222223 | 0 |
| 0.9166666666666666 | 0 |
| 0.9173611111111111 | 0 |
| 0.9180555555555556 | 0 |
| 0.9187500000000001 | 0 |
| 0.9194444444444444 | 0 |
| 0.9201388888888888 | 0 |
| 0.9208333333333334 | 0 |
| 0.9215277777777778 | 0 |
| 0.9222222222222222 | 0 |
| 0.9229166666666666 | 0 |
| 0.9236111111111112 | 0 |
| 0.9243055555555556 | 0 |
| 0.9249999999999999 | 0 |
| 0.9256944444444444 | 0 |
| 0.9263888888888889 | 0 |
| 0.9270833333333334 | 0 |
| 0.9277777777777777 | 0 |
| 0.9284722222222223 | 0 |
| 0.9291666666666667 | 0 |
| 0.9298611111111111 | 0 |
| 0.9305555555555555 | 0 |
| 0.93125 | 0 |
| 0.9319444444444445 | 0 |
| 0.9326388888888889 | 0 |
| 0.9333333333333332 | 0 |
| 0.9340277777777778 | 0 |
| 0.9347222222222222 | 0 |
| 0.9354166666666667 | 0 |
| 0.936111111111111 | 0 |
| 0.9368055555555556 | 0 |
| 0.9375 | 0 |
| 0.9381944444444444 | 0 |
| 0.938888888888889 | 0 |
| 0.9395833333333333 | 0 |
| 0.9402777777777778 | 0 |
| 0.9409722222222222 | 0 |
| 0.9416666666666668 | 0 |
| 0.9423611111111111 | 0 |
| 0.9430555555555555 | 0 |
| 0.94375 | 0 |
| 0.9444444444444445 | 0 |
| 0.9451388888888889 | 0 |
| 0.9458333333333333 | 0 |
| 0.9465277777777777 | 0 |
| 0.9472222222222223 | 0 |
| 0.9479166666666666 | 0 |
| 0.9486111111111111 | 0 |
| 0.9493055555555556 | 0 |
| 0.9500000000000001 | 0 |
| 0.9506944444444444 | 0 |
| 0.9513888888888888 | 0 |
| 0.9520833333333334 | 0 |
| 0.9527777777777778 | 0 |
| 0.9534722222222222 | 0 |
| 0.9541666666666666 | 0 |
| 0.9548611111111112 | 0 |
| 0.9555555555555556 | 0 |
| 0.9562499999999999 | 0 |
| 0.9569444444444444 | 0 |
| 0.9576388888888889 | 0 |
| 0.9583333333333334 | 0 |
| 0.9590277777777777 | 0 |
| 0.9597222222222223 | 0 |
| 0.9604166666666667 | 0 |
| 0.9611111111111111 | 0 |
| 0.9618055555555555 | 0 |
| 0.9625 | 0 |
| 0.9631944444444445 | 0 |
| 0.9638888888888889 | 0 |
| 0.9645833333333332 | 0 |
| 0.9652777777777778 | 0 |
| 0.9659722222222222 | 0 |
| 0.9666666666666667 | 0 |
| 0.967361111111111 | 0 |
| 0.9680555555555556 | 0 |
| 0.96875 | 0 |
| 0.9694444444444444 | 0 |
| 0.970138888888889 | 0 |
| 0.9708333333333333 | 0 |
| 0.9715277777777778 | 0 |
| 0.9722222222222222 | 0 |
| 0.9729166666666668 | 0 |
| 0.9736111111111111 | 0 |
| 0.9743055555555555 | 0 |
| 0.975 | 0 |
| 0.9756944444444445 | 0 |
| 0.9763888888888889 | 0 |
| 0.9770833333333333 | 0 |
| 0.9777777777777777 | 0 |
| 0.9784722222222223 | 0 |
| 0.9791666666666666 | 0 |
| 0.9798611111111111 | 0 |
| 0.9805555555555556 | 0 |
| 0.9812500000000001 | 0 |
| 0.9819444444444444 | 0 |
| 0.9826388888888888 | 0 |
| 0.9833333333333334 | 0 |
| 0.9840277777777778 | 0 |
| 0.9847222222222222 | 0 |
| 0.9854166666666666 | 0 |
| 0.9861111111111112 | 0 |
| 0.9868055555555556 | 0 |
| 0.9874999999999999 | 0 |
| 0.9881944444444444 | 0 |
| 0.9888888888888889 | 0 |
| 0.9895833333333334 | 0 |
| 0.9902777777777777 | 0 |
| 0.9909722222222223 | 0 |
| 0.9916666666666667 | 0 |
| 0.9923611111111111 | 0 |
| 0.9930555555555555 | 0 |
| 0.99375 | 0 |
| 0.9944444444444445 | 0 |
| 0.9951388888888889 | 0 |
| 0.9958333333333332 | 0 |
| 0.9965277777777778 | 0 |
| 0.9972222222222222 | 0 |
| 0.9979166666666667 | 0 |
| 0.998611111111111 | 0 |
| 0.9993055555555556 | 0 |